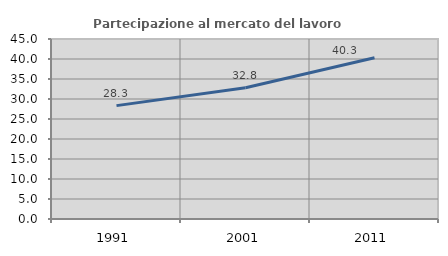
| Category | Partecipazione al mercato del lavoro  femminile |
|---|---|
| 1991.0 | 28.341 |
| 2001.0 | 32.826 |
| 2011.0 | 40.321 |